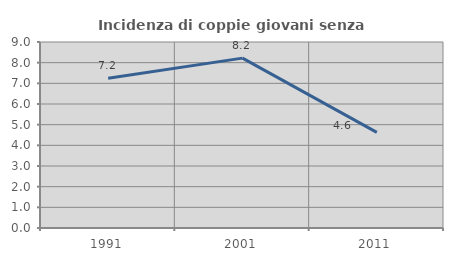
| Category | Incidenza di coppie giovani senza figli |
|---|---|
| 1991.0 | 7.244 |
| 2001.0 | 8.22 |
| 2011.0 | 4.628 |